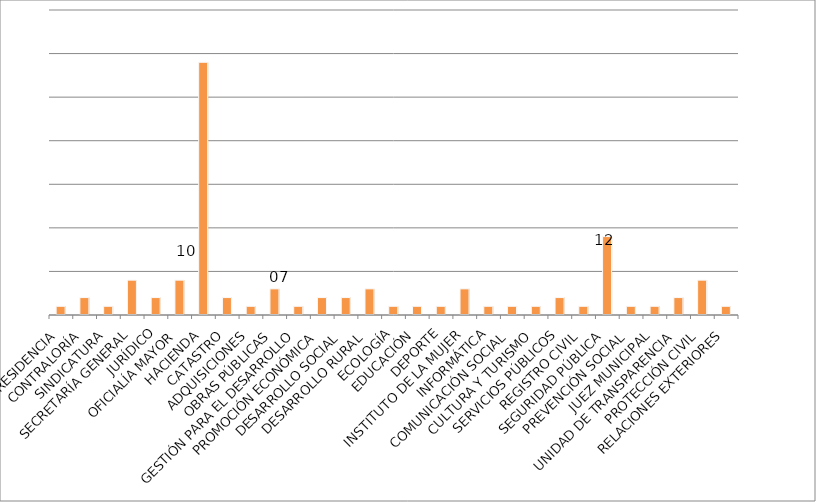
| Category | Series 0 |
|---|---|
| PRESIDENCIA | 1 |
| CONTRALORÍA | 2 |
| SINDICATURA | 1 |
| SECRETARÍA GENERAL | 4 |
| JURÍDICO | 2 |
| OFICIALÍA MAYOR | 4 |
| HACIENDA | 29 |
| CATASTRO | 2 |
| ADQUISICIONES | 1 |
| OBRAS PÚBLICAS | 3 |
| GESTIÓN PARA EL DESARROLLO | 1 |
| PROMOCIÓN ECONÓMICA | 2 |
| DESARROLLO SOCIAL | 2 |
| DESARROLLO RURAL | 3 |
| ECOLOGÍA | 1 |
| EDUCACIÓN | 1 |
| DEPORTE | 1 |
| INSTITUTO DE LA MUJER | 3 |
| INFORMÁTICA | 1 |
| COMUNICACIÓN SOCIAL | 1 |
| CULTURA Y TURISMO | 1 |
| SERVICIOS PÚBLICOS | 2 |
| REGISTRO CIVIL | 1 |
| SEGURIDAD PÚBLICA | 9 |
| PREVENCIÓN SOCIAL | 1 |
| JUEZ MUNICIPAL | 1 |
| UNIDAD DE TRANSPARENCIA | 2 |
| PROTECCIÓN CIVIL | 4 |
| RELACIONES EXTERIORES | 1 |